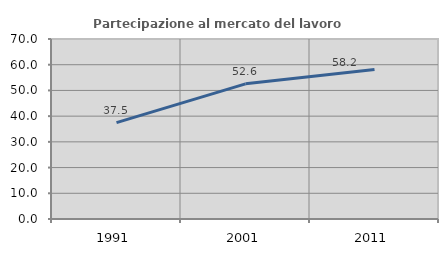
| Category | Partecipazione al mercato del lavoro  femminile |
|---|---|
| 1991.0 | 37.5 |
| 2001.0 | 52.556 |
| 2011.0 | 58.182 |